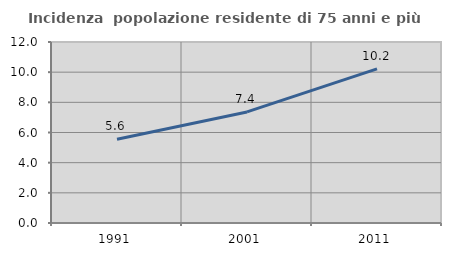
| Category | Incidenza  popolazione residente di 75 anni e più |
|---|---|
| 1991.0 | 5.551 |
| 2001.0 | 7.364 |
| 2011.0 | 10.223 |